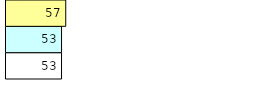
| Category | Total Standouts | Total Recd | Total Tipsters |
|---|---|---|---|
| 0 | 53 | 53 | 57 |